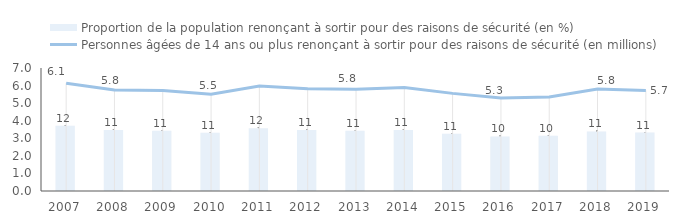
| Category | Proportion de la population renonçant à sortir pour des raisons de sécurité (en %) |
|---|---|
| 2007.0 | 12.18 |
| 2008.0 | 11.42 |
| 2009.0 | 11.27 |
| 2010.0 | 10.9 |
| 2011.0 | 11.75 |
| 2012.0 | 11.4 |
| 2013.0 | 11.27 |
| 2014.0 | 11.41 |
| 2015.0 | 10.72 |
| 2016.0 | 10.21 |
| 2017.0 | 10.33 |
| 2018.0 | 11.13 |
| 2019.0 | 10.92 |